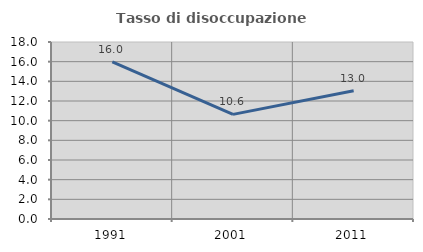
| Category | Tasso di disoccupazione giovanile  |
|---|---|
| 1991.0 | 15.972 |
| 2001.0 | 10.638 |
| 2011.0 | 13.043 |